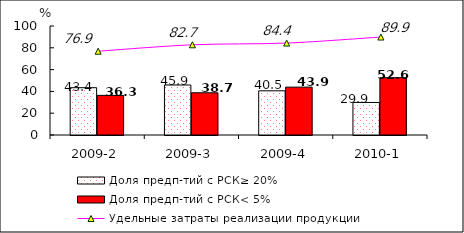
| Category | Доля предп-тий с РСК≥ 20% | Доля предп-тий с РСК< 5% |
|---|---|---|
| 2009-2 | 43.392 | 36.344 |
| 2009-3 | 45.858 | 38.729 |
| 2009-4 | 40.531 | 43.92 |
| 2010-1 | 29.852 | 52.593 |